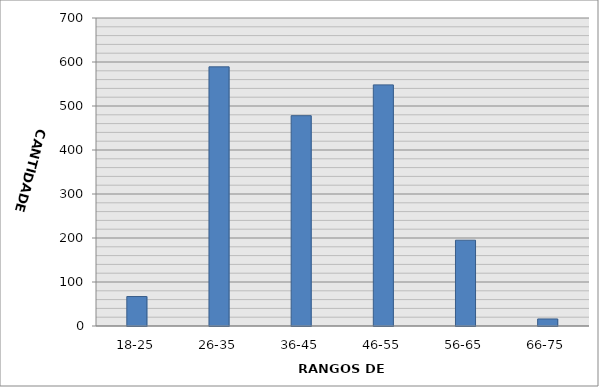
| Category | Series 0 |
|---|---|
| 18-25 | 67 |
| 26-35 | 589 |
| 36-45 | 478 |
| 46-55 | 548 |
| 56-65 | 195 |
| 66-75 | 16 |